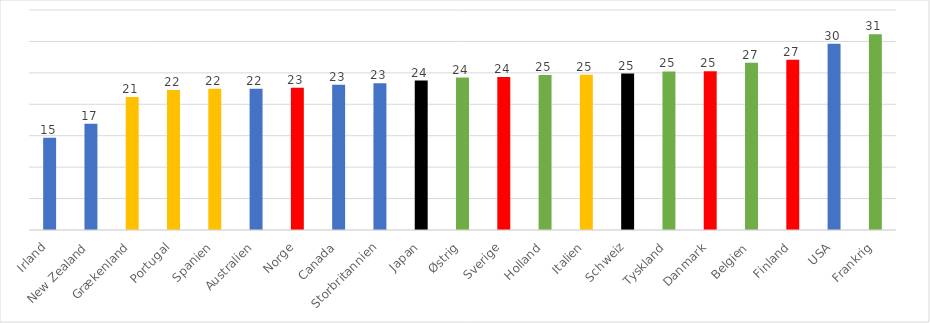
| Category | Offentlige + Private nettoudgifter til velfærd |
|---|---|
| Irland | 14.661 |
| New Zealand | 16.913 |
| Grækenland | 21.143 |
| Portugal | 22.267 |
| Spanien | 22.47 |
| Australien | 22.48 |
| Norge | 22.623 |
| Canada | 23.123 |
| Storbritannien | 23.333 |
| Japan | 23.772 |
| Østrig | 24.26 |
| Sverige | 24.354 |
| Holland | 24.669 |
| Italien | 24.693 |
| Schweiz | 24.89 |
| Tyskland | 25.226 |
| Danmark | 25.241 |
| Belgien | 26.595 |
| Finland | 27.096 |
| USA | 29.643 |
| Frankrig | 31.152 |